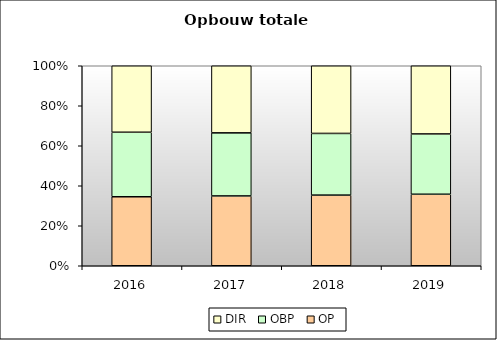
| Category | OP | OBP | DIR |
|---|---|---|---|
| 2016.0 | 61679.88 | 57678.48 | 59439.638 |
| 2017.0 | 63842.58 | 57678.48 | 61363.854 |
| 2018.0 | 66071.7 | 57678.48 | 63286.542 |
| 2019.0 | 68394.78 | 57678.48 | 65200.051 |